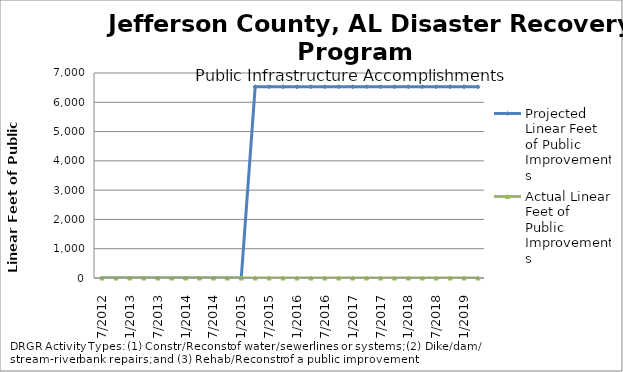
| Category | Projected Linear Feet of Public Improvements | Actual Linear Feet of Public Improvements |
|---|---|---|
| 7/2012 | 0 | 0 |
| 10/2012 | 0 | 0 |
| 1/2013 | 0 | 0 |
| 4/2013 | 0 | 0 |
| 7/2013 | 0 | 0 |
| 10/2013 | 0 | 0 |
| 1/2014 | 0 | 0 |
| 4/2014 | 0 | 0 |
| 7/2014 | 0 | 0 |
| 10/2014 | 0 | 0 |
| 1/2015 | 0 | 0 |
| 4/2015 | 6529 | 0 |
| 7/2015 | 6529 | 0 |
| 10/2015 | 6529 | 0 |
| 1/2016 | 6529 | 0 |
| 4/2016 | 6529 | 0 |
| 7/2016 | 6529 | 0 |
| 10/2016 | 6529 | 0 |
| 1/2017 | 6529 | 0 |
| 4/2017 | 6529 | 0 |
| 7/2017 | 6529 | 0 |
| 10/2017 | 6529 | 0 |
| 1/2018 | 6529 | 0 |
| 4/2018 | 6529 | 0 |
| 7/2018 | 6529 | 0 |
| 10/2018 | 6529 | 0 |
| 1/2019 | 6529 | 0 |
| 4/2019 | 6529 | 0 |